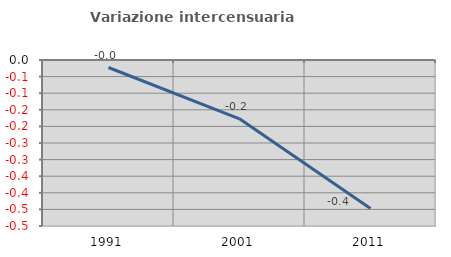
| Category | Variazione intercensuaria annua |
|---|---|
| 1991.0 | -0.023 |
| 2001.0 | -0.177 |
| 2011.0 | -0.447 |